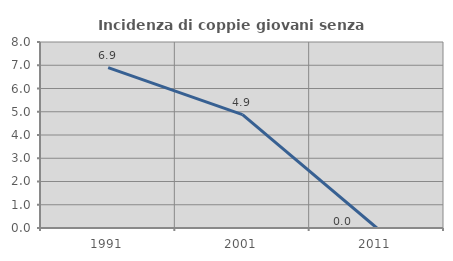
| Category | Incidenza di coppie giovani senza figli |
|---|---|
| 1991.0 | 6.897 |
| 2001.0 | 4.878 |
| 2011.0 | 0 |